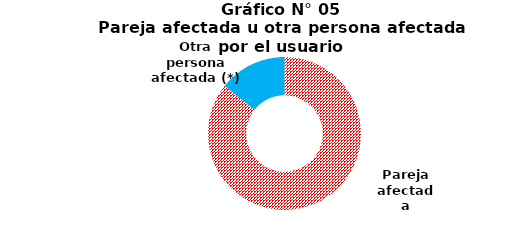
| Category | Series 0 |
|---|---|
| Pareja afectada | 1479 |
| Otra persona afectada (*) | 247 |